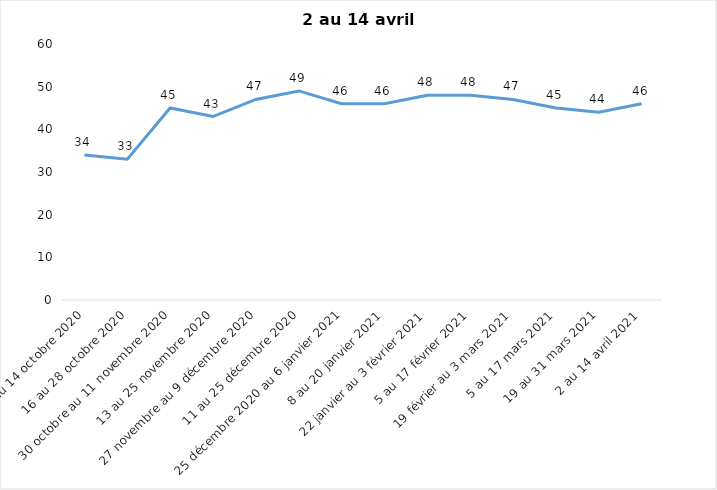
| Category | Toujours aux trois mesures |
|---|---|
| 2 au 14 octobre 2020 | 34 |
| 16 au 28 octobre 2020 | 33 |
| 30 octobre au 11 novembre 2020 | 45 |
| 13 au 25 novembre 2020 | 43 |
| 27 novembre au 9 décembre 2020 | 47 |
| 11 au 25 décembre 2020 | 49 |
| 25 décembre 2020 au 6 janvier 2021 | 46 |
| 8 au 20 janvier 2021 | 46 |
| 22 janvier au 3 février 2021 | 48 |
| 5 au 17 février 2021 | 48 |
| 19 février au 3 mars 2021 | 47 |
| 5 au 17 mars 2021 | 45 |
| 19 au 31 mars 2021 | 44 |
| 2 au 14 avril 2021 | 46 |